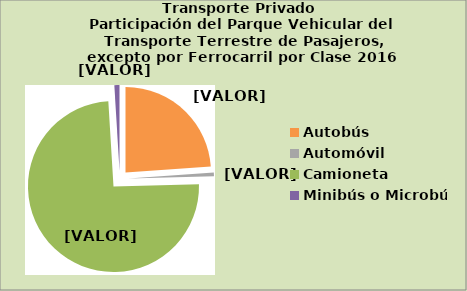
| Category | Series 0 |
|---|---|
| Autobús | 23.855 |
| Automóvil | 0.723 |
| Camioneta | 74.4 |
| Minibús o Microbús | 0.964 |